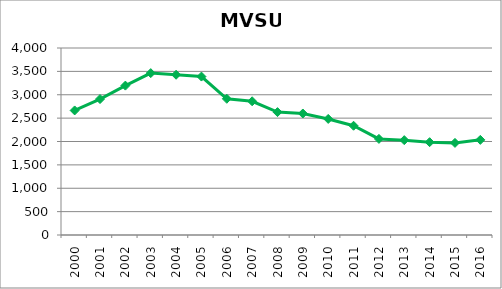
| Category | Series 0 |
|---|---|
| 2000.0 | 2664.308 |
| 2001.0 | 2908.025 |
| 2002.0 | 3195.358 |
| 2003.0 | 3462.75 |
| 2004.0 | 3427.692 |
| 2005.0 | 3389.008 |
| 2006.0 | 2914.1 |
| 2007.0 | 2860.175 |
| 2008.0 | 2628.508 |
| 2009.0 | 2599.208 |
| 2010.0 | 2482.767 |
| 2011.0 | 2336.942 |
| 2012.0 | 2055.658 |
| 2013.0 | 2028.875 |
| 2014.0 | 1985.95 |
| 2015.0 | 1970.042 |
| 2016.0 | 2035.083 |